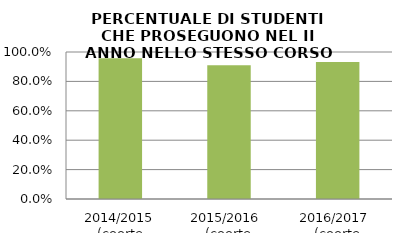
| Category | 2014/2015 (coorte 2013/14) 2015/2016  (coorte 2014/15) 2016/2017  (coorte 2015/16) |
|---|---|
| 2014/2015 (coorte 2013/14) | 0.957 |
| 2015/2016  (coorte 2014/15) | 0.909 |
| 2016/2017  (coorte 2015/16) | 0.932 |